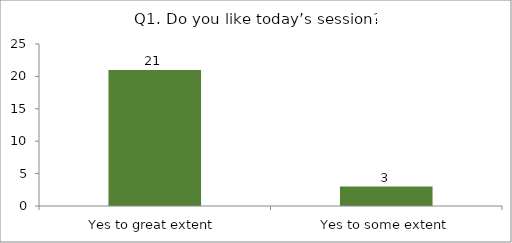
| Category | Q1. Do you like today’s session? |
|---|---|
| Yes to great extent | 21 |
| Yes to some extent | 3 |